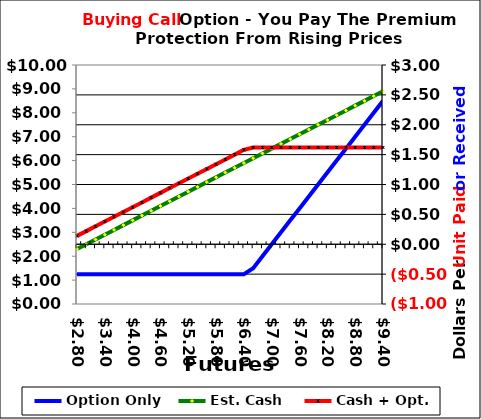
| Category | Option Only |
|---|---|
| 2.799999999999997 | -0.5 |
| 2.9999999999999973 | -0.5 |
| 3.1999999999999975 | -0.5 |
| 3.3999999999999977 | -0.5 |
| 3.599999999999998 | -0.5 |
| 3.799999999999998 | -0.5 |
| 3.9999999999999982 | -0.5 |
| 4.199999999999998 | -0.5 |
| 4.399999999999999 | -0.5 |
| 4.599999999999999 | -0.5 |
| 4.799999999999999 | -0.5 |
| 4.999999999999999 | -0.5 |
| 5.199999999999999 | -0.5 |
| 5.3999999999999995 | -0.5 |
| 5.6 | -0.5 |
| 5.8 | -0.5 |
| 6.0 | -0.5 |
| 6.2 | -0.5 |
| 6.4 | -0.5 |
| 6.6000000000000005 | -0.4 |
| 6.800000000000001 | -0.2 |
| 7.000000000000001 | 0 |
| 7.200000000000001 | 0.2 |
| 7.400000000000001 | 0.4 |
| 7.600000000000001 | 0.6 |
| 7.800000000000002 | 0.8 |
| 8.000000000000002 | 1 |
| 8.200000000000001 | 1.2 |
| 8.4 | 1.4 |
| 8.6 | 1.6 |
| 8.799999999999999 | 1.8 |
| 8.999999999999998 | 2 |
| 9.199999999999998 | 2.2 |
| 9.399999999999997 | 2.4 |